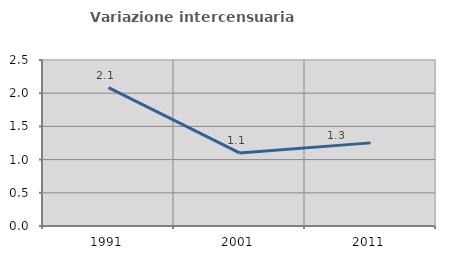
| Category | Variazione intercensuaria annua |
|---|---|
| 1991.0 | 2.084 |
| 2001.0 | 1.101 |
| 2011.0 | 1.252 |